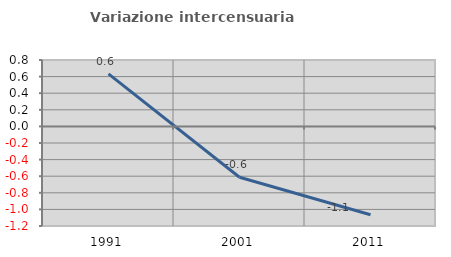
| Category | Variazione intercensuaria annua |
|---|---|
| 1991.0 | 0.633 |
| 2001.0 | -0.612 |
| 2011.0 | -1.065 |